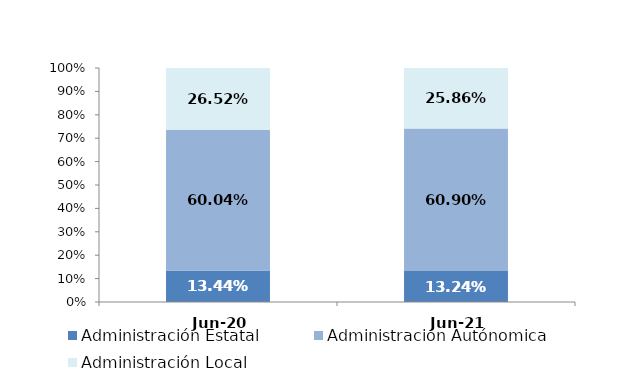
| Category | Administración Estatal | Administración Autónomica | Administración Local |
|---|---|---|---|
| 2020-06-01 | 0.134 | 0.6 | 0.265 |
| 2021-06-01 | 0.132 | 0.609 | 0.259 |